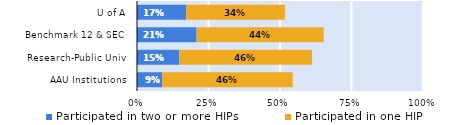
| Category | Participated in two or more HIPs | Participated in one HIP |
|---|---|---|
| AAU Institutions | 0.089 | 0.456 |
| Research-Public Univ | 0.148 | 0.464 |
| Benchmark 12 & SEC | 0.208 | 0.444 |
| U of A | 0.172 | 0.345 |